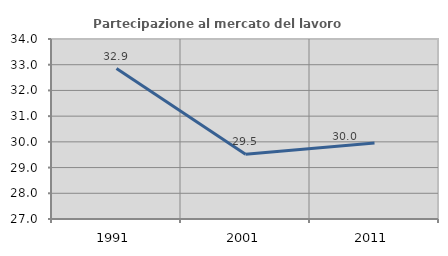
| Category | Partecipazione al mercato del lavoro  femminile |
|---|---|
| 1991.0 | 32.851 |
| 2001.0 | 29.515 |
| 2011.0 | 29.955 |